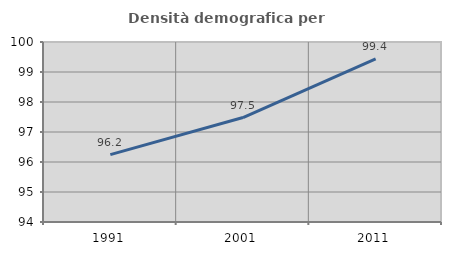
| Category | Densità demografica |
|---|---|
| 1991.0 | 96.244 |
| 2001.0 | 97.483 |
| 2011.0 | 99.439 |